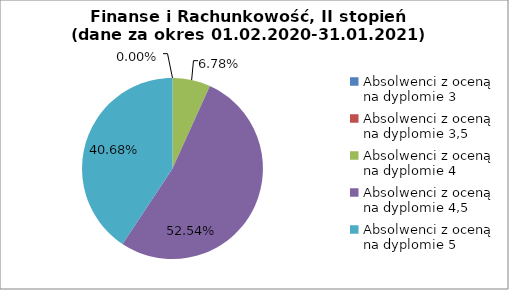
| Category | Series 0 |
|---|---|
| Absolwenci z oceną na dyplomie 3 | 0 |
| Absolwenci z oceną na dyplomie 3,5 | 0 |
| Absolwenci z oceną na dyplomie 4 | 6.78 |
| Absolwenci z oceną na dyplomie 4,5 | 52.542 |
| Absolwenci z oceną na dyplomie 5 | 40.678 |